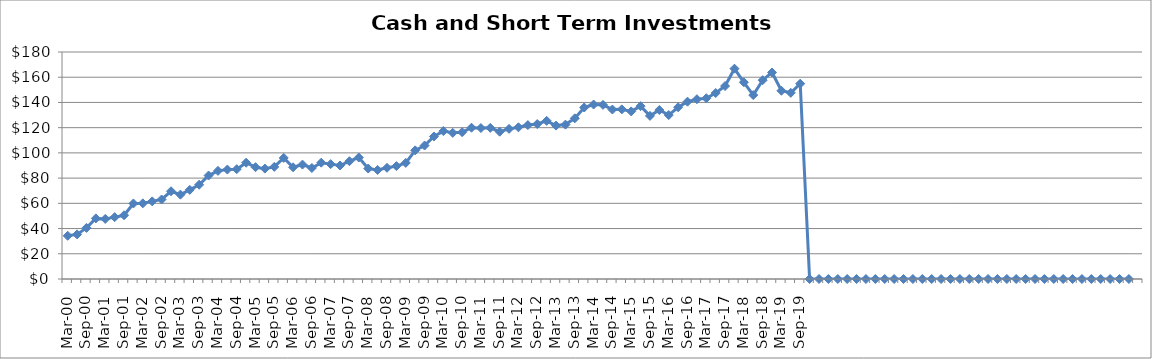
| Category | Cash and Short-Term Investments ($Millions) |
|---|---|
| Mar-00 | 34.28 |
| Jun-00 | 35.374 |
| Sep-00 | 40.504 |
| Dec-00 | 48.051 |
| Mar-01 | 47.628 |
| Jun-01 | 49.066 |
| Sep-01 | 50.532 |
| Dec-01 | 59.884 |
| Mar-02 | 59.996 |
| Jun-02 | 61.547 |
| Sep-02 | 63.052 |
| Dec-02 | 69.58 |
| Mar-03 | 66.89 |
| Jun-03 | 70.69 |
| Sep-03 | 74.753 |
| Dec-03 | 82.036 |
| Mar-04 | 85.75 |
| Jun-04 | 86.754 |
| Sep-04 | 87.091 |
| Dec-04 | 92.22 |
| Mar-05 | 88.646 |
| Jun-05 | 87.535 |
| Sep-05 | 88.924 |
| Dec-05 | 96 |
| Mar-06 | 88.574 |
| Jun-06 | 90.724 |
| Sep-06 | 88.014 |
| Dec-06 | 92.227 |
| Mar-07 | 91.094 |
| Jun-07 | 90 |
| Sep-07 | 93.412 |
| Dec-07 | 96.325 |
| Mar-08 | 87.59 |
| Jun-08 | 86.476 |
| Sep-08 | 88.204 |
| Dec-08 | 89.514 |
| Mar-09 | 92.076 |
| Jun-09 | 101.996 |
| Sep-09 | 105.844 |
| Dec-09 | 113 |
| Mar-10 | 117.29 |
| Jun-10 | 115.9 |
| Sep-10 | 116.424 |
| Dec-10 | 119.952 |
| Mar-11 | 119.694 |
| Jun-11 | 119.842 |
| Sep-11 | 116.788 |
| Dec-11 | 119.052 |
| Mar-12 | 120.313 |
| Jun-12 | 122.034 |
| Sep-12 | 122.88 |
| Dec-12 | 125.388 |
| Mar-13 | 121.644 |
| Jun-13 | 122.423 |
| Sep-13 | 127.4 |
| Dec-13 | 135.98 |
| Mar-14 | 138.346 |
| Jun-14 | 138.086 |
| Sep-14 | 134.388 |
| Dec-14 | 134.508 |
| Mar-15 | 132.884 |
| Jun-15 | 137.077 |
| Sep-15 | 129.35 |
| Dec-15 | 134 |
| Mar-16 | 130.016 |
| Jun-16 | 136.183 |
| Sep-16 | 140.608 |
| Dec-16 | 142.571 |
| Mar-17 | 143.333 |
| Jun-17 | 147.468 |
| Sep-17 | 153.036 |
| Dec-17 | 166.786 |
| Mar-18 | 156.003 |
| Jun-18 | 145.832 |
| Sep-18 | 157.641 |
| Dec-18 | 163.774 |
| Mar-19 | 149.285 |
| Jun-19 | 147.617 |
| Sep-19 | 154.874 |